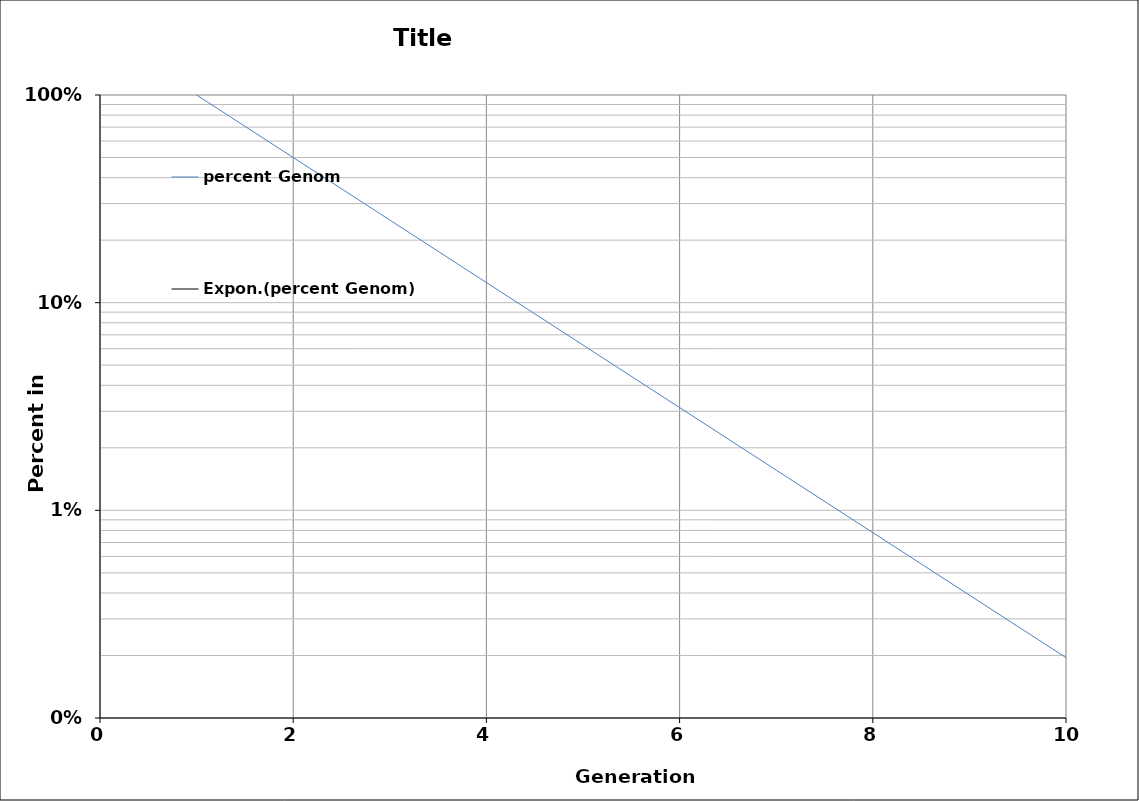
| Category | percent Genom |
|---|---|
| 1.0 | 1 |
| 2.0 | 0.5 |
| 3.0 | 0.25 |
| 4.0 | 0.125 |
| 5.0 | 0.062 |
| 6.0 | 0.031 |
| 7.0 | 0.016 |
| 8.0 | 0.008 |
| 9.0 | 0.004 |
| 10.0 | 0.002 |
| 11.0 | 0.001 |
| 12.0 | 0 |
| 13.0 | 0 |
| 14.0 | 0 |
| 15.0 | 0 |
| 16.0 | 0 |
| 17.0 | 0 |
| 18.0 | 0 |
| 19.0 | 0 |
| 20.0 | 0 |
| 21.0 | 0 |
| 22.0 | 0 |
| 23.0 | 0 |
| 24.0 | 0 |